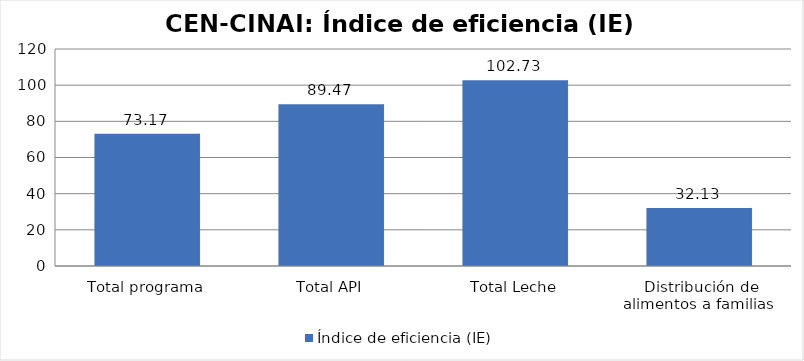
| Category | Índice de eficiencia (IE)  |
|---|---|
| Total programa | 73.168 |
| Total API | 89.467 |
| Total Leche | 102.726 |
| Distribución de alimentos a familias  | 32.135 |